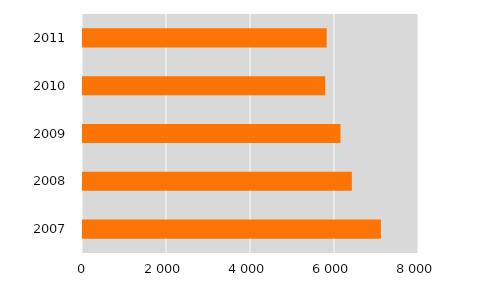
| Category | Series 1 |
|---|---|
| 2007.0 | 7093 |
| 2008.0 | 6401 |
| 2009.0 | 6131 |
| 2010.0 | 5767 |
| 2011.0 | 5802 |